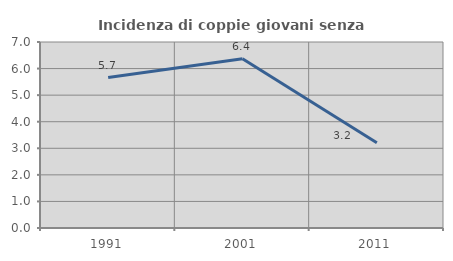
| Category | Incidenza di coppie giovani senza figli |
|---|---|
| 1991.0 | 5.66 |
| 2001.0 | 6.369 |
| 2011.0 | 3.205 |